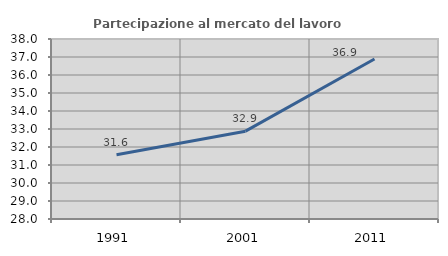
| Category | Partecipazione al mercato del lavoro  femminile |
|---|---|
| 1991.0 | 31.569 |
| 2001.0 | 32.879 |
| 2011.0 | 36.885 |